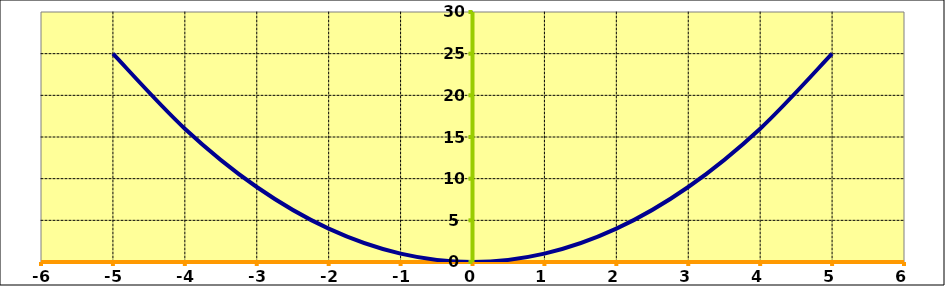
| Category | Series 0 |
|---|---|
| -5.0 | 25 |
| -4.0 | 16 |
| -3.0 | 9 |
| -2.0 | 4 |
| -1.0 | 1 |
| 0.0 | 0 |
| 1.0 | 1 |
| 2.0 | 4 |
| 3.0 | 9 |
| 4.0 | 16 |
| 5.0 | 25 |